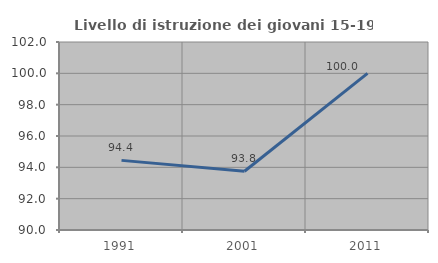
| Category | Livello di istruzione dei giovani 15-19 anni |
|---|---|
| 1991.0 | 94.444 |
| 2001.0 | 93.75 |
| 2011.0 | 100 |